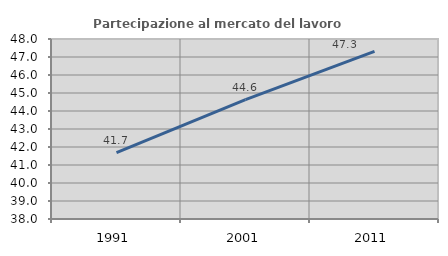
| Category | Partecipazione al mercato del lavoro  femminile |
|---|---|
| 1991.0 | 41.691 |
| 2001.0 | 44.635 |
| 2011.0 | 47.309 |